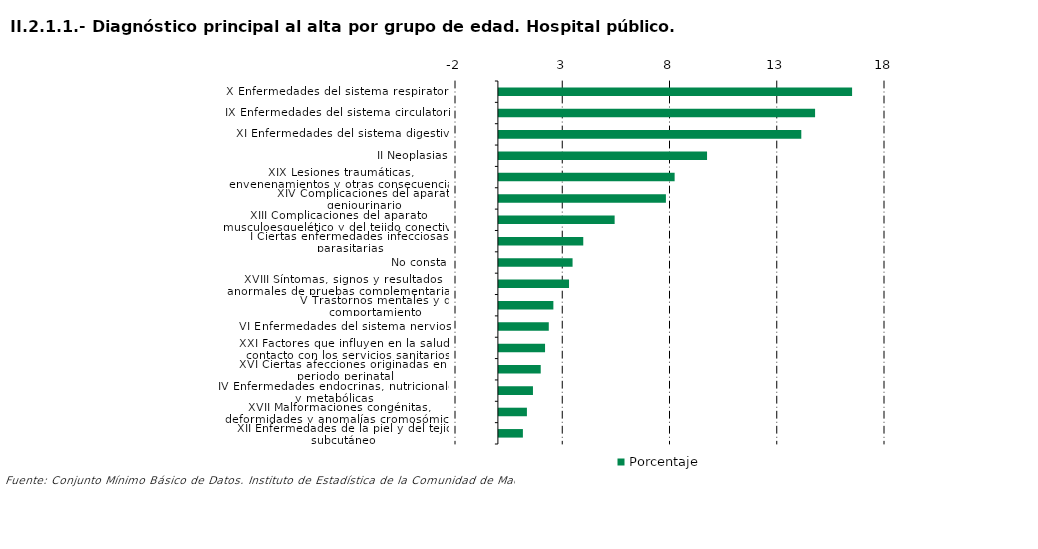
| Category | Porcentaje |
|---|---|
| X Enfermedades del sistema respiratorio | 16.466 |
| IX Enfermedades del sistema circulatorio | 14.74 |
| XI Enfermedades del sistema digestivo | 14.098 |
| II Neoplasias | 9.704 |
| XIX Lesiones traumáticas, envenenamientos y otras consecuencias de causas externas | 8.193 |
| XIV Complicaciones del aparato geniourinario | 7.786 |
| XIII Complicaciones del aparato musculoesquelético y del tejido conectivo | 5.396 |
| I Ciertas enfermedades infecciosas y parasitarias | 3.933 |
| No consta | 3.434 |
| XVIII Síntomas, signos y resultados anormales de pruebas complementarias, no clasificados bajo otro concepto | 3.269 |
| V Trastornos mentales y de comportamiento | 2.539 |
| VI Enfermedades del sistema nervioso | 2.325 |
| XXI Factores que influyen en la salud y contacto con los servicios sanitarios | 2.152 |
| XVI Ciertas afecciones originadas en el periodo perinatal | 1.95 |
| IV Enfermedades endocrinas, nutricionales y metabólicas | 1.588 |
| XVII Malformaciones congénitas, deformidades y anomalías cromosómicas | 1.306 |
| XII Enfermedades de la piel y del tejido subcutáneo | 1.119 |